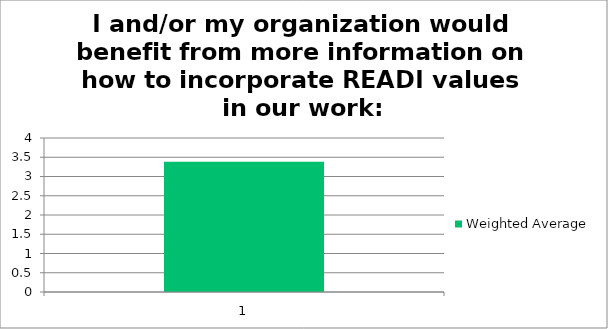
| Category | Weighted Average |
|---|---|
| 1.0 | 3.38 |